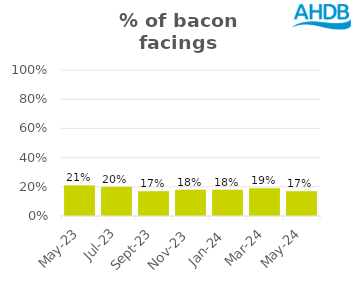
| Category | Bacon |
|---|---|
| 2023-05-01 | 0.21 |
| 2023-07-01 | 0.2 |
| 2023-09-01 | 0.17 |
| 2023-11-01 | 0.18 |
| 2024-01-01 | 0.18 |
| 2024-03-01 | 0.19 |
| 2024-05-01 | 0.17 |